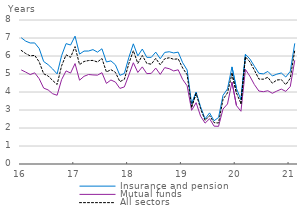
| Category | Insurance and pension | Mutual funds | All sectors |
|---|---|---|---|
| 2016-01-01 | 7.014 | 5.227 | 6.311 |
| 2016-02-01 | 6.825 | 5.105 | 6.136 |
| 2016-03-01 | 6.722 | 4.968 | 6.006 |
| 2016-04-01 | 6.726 | 5.065 | 6.035 |
| 2016-05-01 | 6.419 | 4.739 | 5.675 |
| 2016-06-01 | 5.694 | 4.218 | 5.014 |
| 2016-07-01 | 5.518 | 4.115 | 4.888 |
| 2016-08-01 | 5.28 | 3.904 | 4.641 |
| 2016-09-01 | 5.003 | 3.819 | 4.417 |
| 2016-10-01 | 6.021 | 4.688 | 5.454 |
| 2016-11-01 | 6.688 | 5.171 | 6.063 |
| 2016-12-01 | 6.609 | 5.052 | 5.925 |
| 2017-01-01 | 7.104 | 5.579 | 6.522 |
| 2017-02-01 | 6.104 | 4.655 | 5.522 |
| 2017-03-01 | 6.274 | 4.871 | 5.695 |
| 2017-04-01 | 6.277 | 4.971 | 5.747 |
| 2017-05-01 | 6.354 | 4.949 | 5.754 |
| 2017-06-01 | 6.215 | 4.936 | 5.667 |
| 2017-07-01 | 6.402 | 5.073 | 5.863 |
| 2017-08-01 | 5.669 | 4.478 | 5.111 |
| 2017-09-01 | 5.729 | 4.667 | 5.239 |
| 2017-10-01 | 5.513 | 4.552 | 5.094 |
| 2017-11-01 | 4.926 | 4.199 | 4.574 |
| 2017-12-01 | 5.03 | 4.282 | 4.702 |
| 2018-01-01 | 5.919 | 4.943 | 5.581 |
| 2018-02-01 | 6.677 | 5.625 | 6.297 |
| 2018-03-01 | 6.004 | 5.087 | 5.59 |
| 2018-04-01 | 6.387 | 5.396 | 6.029 |
| 2018-05-01 | 5.927 | 5.021 | 5.592 |
| 2018-06-01 | 5.925 | 5.034 | 5.544 |
| 2018-07-01 | 6.215 | 5.329 | 5.87 |
| 2018-08-01 | 5.847 | 4.979 | 5.51 |
| 2018-09-01 | 6.2 | 5.355 | 5.846 |
| 2018-10-01 | 6.237 | 5.295 | 5.901 |
| 2018-11-01 | 6.17 | 5.171 | 5.817 |
| 2018-12-01 | 6.216 | 5.233 | 5.844 |
| 2019-01-01 | 5.626 | 4.695 | 5.334 |
| 2019-02-01 | 5.221 | 4.342 | 4.957 |
| 2019-03-01 | 3.342 | 2.98 | 3.175 |
| 2019-04-01 | 3.996 | 3.407 | 3.912 |
| 2019-05-01 | 3.179 | 2.657 | 3.071 |
| 2019-06-01 | 2.507 | 2.27 | 2.421 |
| 2019-07-01 | 2.84 | 2.515 | 2.687 |
| 2019-08-01 | 2.401 | 2.103 | 2.298 |
| 2019-09-01 | 2.582 | 2.092 | 2.277 |
| 2019-10-01 | 3.814 | 3.054 | 3.588 |
| 2019-11-01 | 4.174 | 3.335 | 3.954 |
| 2019-12-01 | 5.393 | 4.55 | 5.013 |
| 2020-01-01 | 4.196 | 3.245 | 3.942 |
| 2020-02-01 | 3.573 | 2.929 | 3.36 |
| 2020-03-01 | 6.094 | 5.256 | 5.958 |
| 2020-04-01 | 5.835 | 4.871 | 5.668 |
| 2020-05-01 | 5.431 | 4.411 | 5.209 |
| 2020-06-01 | 5.037 | 4.053 | 4.718 |
| 2020-07-01 | 5.007 | 4.017 | 4.711 |
| 2020-08-01 | 5.142 | 4.071 | 4.817 |
| 2020-09-01 | 4.891 | 3.93 | 4.488 |
| 2020-10-01 | 4.991 | 4.052 | 4.667 |
| 2020-11-01 | 5.056 | 4.16 | 4.687 |
| 2020-12-01 | 4.832 | 4.034 | 4.406 |
| 2021-01-01 | 5.148 | 4.304 | 4.765 |
| 2021-02-01 | 6.702 | 5.759 | 6.321 |